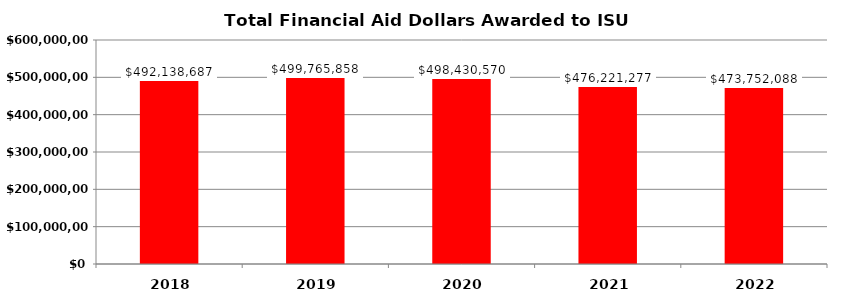
| Category | Total Amount Awarded |
|---|---|
| 2018.0 | 492138687 |
| 2019.0 | 499765858 |
| 2020.0 | 498430570 |
| 2021.0 | 476221277 |
| 2022.0 | 473752088 |